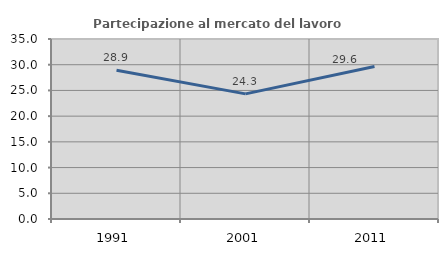
| Category | Partecipazione al mercato del lavoro  femminile |
|---|---|
| 1991.0 | 28.938 |
| 2001.0 | 24.335 |
| 2011.0 | 29.644 |